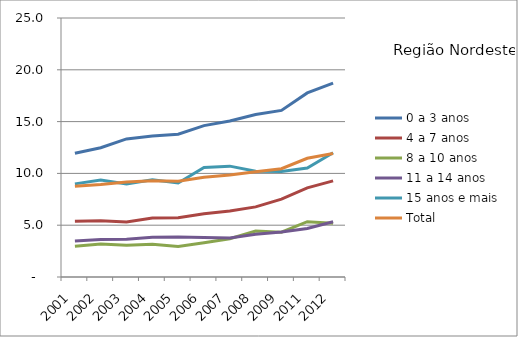
| Category | 0 a 3 anos | 4 a 7 anos | 8 a 10 anos | 11 a 14 anos | 15 anos e mais | Total |
|---|---|---|---|---|---|---|
| 2001.0 | 11.94 | 5.38 | 2.96 | 3.48 | 8.99 | 8.75 |
| 2002.0 | 12.48 | 5.44 | 3.18 | 3.61 | 9.37 | 8.93 |
| 2003.0 | 13.33 | 5.31 | 3.07 | 3.65 | 8.99 | 9.18 |
| 2004.0 | 13.6 | 5.7 | 3.17 | 3.83 | 9.38 | 9.3 |
| 2005.0 | 13.78 | 5.71 | 2.94 | 3.86 | 9.07 | 9.24 |
| 2006.0 | 14.61 | 6.11 | 3.3 | 3.81 | 10.58 | 9.62 |
| 2007.0 | 15.06 | 6.37 | 3.69 | 3.76 | 10.7 | 9.84 |
| 2008.0 | 15.68 | 6.77 | 4.44 | 4.12 | 10.2 | 10.17 |
| 2009.0 | 16.08 | 7.51 | 4.32 | 4.34 | 10.18 | 10.45 |
| 2011.0 | 17.77 | 8.6 | 5.34 | 4.69 | 10.52 | 11.46 |
| 2012.0 | 18.71 | 9.28 | 5.18 | 5.33 | 11.99 | 11.92 |